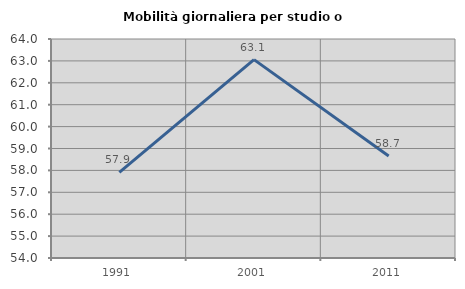
| Category | Mobilità giornaliera per studio o lavoro |
|---|---|
| 1991.0 | 57.906 |
| 2001.0 | 63.059 |
| 2011.0 | 58.656 |